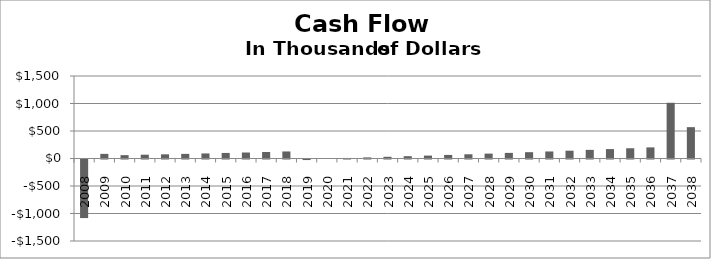
| Category | Cash Flow |
|---|---|
| 2008.0 | -1065 |
| 2009.0 | 84 |
| 2010.0 | 61 |
| 2011.0 | 69 |
| 2012.0 | 76 |
| 2013.0 | 84 |
| 2014.0 | 92 |
| 2015.0 | 101 |
| 2016.0 | 109 |
| 2017.0 | 118 |
| 2018.0 | 128 |
| 2019.0 | -10 |
| 2020.0 | 0 |
| 2021.0 | 10 |
| 2022.0 | 20 |
| 2023.0 | 31 |
| 2024.0 | 42 |
| 2025.0 | 53 |
| 2026.0 | 65 |
| 2027.0 | 77 |
| 2028.0 | 89 |
| 2029.0 | 102 |
| 2030.0 | 115 |
| 2031.0 | 128 |
| 2032.0 | 142 |
| 2033.0 | 157 |
| 2034.0 | 171 |
| 2035.0 | 186 |
| 2036.0 | 202 |
| 2037.0 | 1013 |
| 2038.0 | 570 |